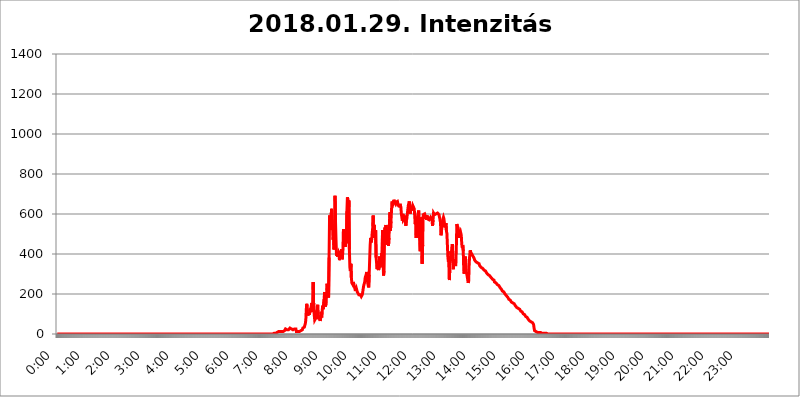
| Category | 2018.01.29. Intenzitás [W/m^2] |
|---|---|
| 0.0 | 0 |
| 0.0006944444444444445 | 0 |
| 0.001388888888888889 | 0 |
| 0.0020833333333333333 | 0 |
| 0.002777777777777778 | 0 |
| 0.003472222222222222 | 0 |
| 0.004166666666666667 | 0 |
| 0.004861111111111111 | 0 |
| 0.005555555555555556 | 0 |
| 0.0062499999999999995 | 0 |
| 0.006944444444444444 | 0 |
| 0.007638888888888889 | 0 |
| 0.008333333333333333 | 0 |
| 0.009027777777777779 | 0 |
| 0.009722222222222222 | 0 |
| 0.010416666666666666 | 0 |
| 0.011111111111111112 | 0 |
| 0.011805555555555555 | 0 |
| 0.012499999999999999 | 0 |
| 0.013194444444444444 | 0 |
| 0.013888888888888888 | 0 |
| 0.014583333333333332 | 0 |
| 0.015277777777777777 | 0 |
| 0.015972222222222224 | 0 |
| 0.016666666666666666 | 0 |
| 0.017361111111111112 | 0 |
| 0.018055555555555557 | 0 |
| 0.01875 | 0 |
| 0.019444444444444445 | 0 |
| 0.02013888888888889 | 0 |
| 0.020833333333333332 | 0 |
| 0.02152777777777778 | 0 |
| 0.022222222222222223 | 0 |
| 0.02291666666666667 | 0 |
| 0.02361111111111111 | 0 |
| 0.024305555555555556 | 0 |
| 0.024999999999999998 | 0 |
| 0.025694444444444447 | 0 |
| 0.02638888888888889 | 0 |
| 0.027083333333333334 | 0 |
| 0.027777777777777776 | 0 |
| 0.02847222222222222 | 0 |
| 0.029166666666666664 | 0 |
| 0.029861111111111113 | 0 |
| 0.030555555555555555 | 0 |
| 0.03125 | 0 |
| 0.03194444444444445 | 0 |
| 0.03263888888888889 | 0 |
| 0.03333333333333333 | 0 |
| 0.034027777777777775 | 0 |
| 0.034722222222222224 | 0 |
| 0.035416666666666666 | 0 |
| 0.036111111111111115 | 0 |
| 0.03680555555555556 | 0 |
| 0.0375 | 0 |
| 0.03819444444444444 | 0 |
| 0.03888888888888889 | 0 |
| 0.03958333333333333 | 0 |
| 0.04027777777777778 | 0 |
| 0.04097222222222222 | 0 |
| 0.041666666666666664 | 0 |
| 0.042361111111111106 | 0 |
| 0.04305555555555556 | 0 |
| 0.043750000000000004 | 0 |
| 0.044444444444444446 | 0 |
| 0.04513888888888889 | 0 |
| 0.04583333333333334 | 0 |
| 0.04652777777777778 | 0 |
| 0.04722222222222222 | 0 |
| 0.04791666666666666 | 0 |
| 0.04861111111111111 | 0 |
| 0.049305555555555554 | 0 |
| 0.049999999999999996 | 0 |
| 0.05069444444444445 | 0 |
| 0.051388888888888894 | 0 |
| 0.052083333333333336 | 0 |
| 0.05277777777777778 | 0 |
| 0.05347222222222222 | 0 |
| 0.05416666666666667 | 0 |
| 0.05486111111111111 | 0 |
| 0.05555555555555555 | 0 |
| 0.05625 | 0 |
| 0.05694444444444444 | 0 |
| 0.057638888888888885 | 0 |
| 0.05833333333333333 | 0 |
| 0.05902777777777778 | 0 |
| 0.059722222222222225 | 0 |
| 0.06041666666666667 | 0 |
| 0.061111111111111116 | 0 |
| 0.06180555555555556 | 0 |
| 0.0625 | 0 |
| 0.06319444444444444 | 0 |
| 0.06388888888888888 | 0 |
| 0.06458333333333334 | 0 |
| 0.06527777777777778 | 0 |
| 0.06597222222222222 | 0 |
| 0.06666666666666667 | 0 |
| 0.06736111111111111 | 0 |
| 0.06805555555555555 | 0 |
| 0.06874999999999999 | 0 |
| 0.06944444444444443 | 0 |
| 0.07013888888888889 | 0 |
| 0.07083333333333333 | 0 |
| 0.07152777777777779 | 0 |
| 0.07222222222222223 | 0 |
| 0.07291666666666667 | 0 |
| 0.07361111111111111 | 0 |
| 0.07430555555555556 | 0 |
| 0.075 | 0 |
| 0.07569444444444444 | 0 |
| 0.0763888888888889 | 0 |
| 0.07708333333333334 | 0 |
| 0.07777777777777778 | 0 |
| 0.07847222222222222 | 0 |
| 0.07916666666666666 | 0 |
| 0.0798611111111111 | 0 |
| 0.08055555555555556 | 0 |
| 0.08125 | 0 |
| 0.08194444444444444 | 0 |
| 0.08263888888888889 | 0 |
| 0.08333333333333333 | 0 |
| 0.08402777777777777 | 0 |
| 0.08472222222222221 | 0 |
| 0.08541666666666665 | 0 |
| 0.08611111111111112 | 0 |
| 0.08680555555555557 | 0 |
| 0.08750000000000001 | 0 |
| 0.08819444444444445 | 0 |
| 0.08888888888888889 | 0 |
| 0.08958333333333333 | 0 |
| 0.09027777777777778 | 0 |
| 0.09097222222222222 | 0 |
| 0.09166666666666667 | 0 |
| 0.09236111111111112 | 0 |
| 0.09305555555555556 | 0 |
| 0.09375 | 0 |
| 0.09444444444444444 | 0 |
| 0.09513888888888888 | 0 |
| 0.09583333333333333 | 0 |
| 0.09652777777777777 | 0 |
| 0.09722222222222222 | 0 |
| 0.09791666666666667 | 0 |
| 0.09861111111111111 | 0 |
| 0.09930555555555555 | 0 |
| 0.09999999999999999 | 0 |
| 0.10069444444444443 | 0 |
| 0.1013888888888889 | 0 |
| 0.10208333333333335 | 0 |
| 0.10277777777777779 | 0 |
| 0.10347222222222223 | 0 |
| 0.10416666666666667 | 0 |
| 0.10486111111111111 | 0 |
| 0.10555555555555556 | 0 |
| 0.10625 | 0 |
| 0.10694444444444444 | 0 |
| 0.1076388888888889 | 0 |
| 0.10833333333333334 | 0 |
| 0.10902777777777778 | 0 |
| 0.10972222222222222 | 0 |
| 0.1111111111111111 | 0 |
| 0.11180555555555556 | 0 |
| 0.11180555555555556 | 0 |
| 0.1125 | 0 |
| 0.11319444444444444 | 0 |
| 0.11388888888888889 | 0 |
| 0.11458333333333333 | 0 |
| 0.11527777777777777 | 0 |
| 0.11597222222222221 | 0 |
| 0.11666666666666665 | 0 |
| 0.1173611111111111 | 0 |
| 0.11805555555555557 | 0 |
| 0.11944444444444445 | 0 |
| 0.12013888888888889 | 0 |
| 0.12083333333333333 | 0 |
| 0.12152777777777778 | 0 |
| 0.12222222222222223 | 0 |
| 0.12291666666666667 | 0 |
| 0.12291666666666667 | 0 |
| 0.12361111111111112 | 0 |
| 0.12430555555555556 | 0 |
| 0.125 | 0 |
| 0.12569444444444444 | 0 |
| 0.12638888888888888 | 0 |
| 0.12708333333333333 | 0 |
| 0.16875 | 0 |
| 0.12847222222222224 | 0 |
| 0.12916666666666668 | 0 |
| 0.12986111111111112 | 0 |
| 0.13055555555555556 | 0 |
| 0.13125 | 0 |
| 0.13194444444444445 | 0 |
| 0.1326388888888889 | 0 |
| 0.13333333333333333 | 0 |
| 0.13402777777777777 | 0 |
| 0.13402777777777777 | 0 |
| 0.13472222222222222 | 0 |
| 0.13541666666666666 | 0 |
| 0.1361111111111111 | 0 |
| 0.13749999999999998 | 0 |
| 0.13819444444444443 | 0 |
| 0.1388888888888889 | 0 |
| 0.13958333333333334 | 0 |
| 0.14027777777777778 | 0 |
| 0.14097222222222222 | 0 |
| 0.14166666666666666 | 0 |
| 0.1423611111111111 | 0 |
| 0.14305555555555557 | 0 |
| 0.14375000000000002 | 0 |
| 0.14444444444444446 | 0 |
| 0.1451388888888889 | 0 |
| 0.1451388888888889 | 0 |
| 0.14652777777777778 | 0 |
| 0.14722222222222223 | 0 |
| 0.14791666666666667 | 0 |
| 0.1486111111111111 | 0 |
| 0.14930555555555555 | 0 |
| 0.15 | 0 |
| 0.15069444444444444 | 0 |
| 0.15138888888888888 | 0 |
| 0.15208333333333332 | 0 |
| 0.15277777777777776 | 0 |
| 0.15347222222222223 | 0 |
| 0.15416666666666667 | 0 |
| 0.15486111111111112 | 0 |
| 0.15555555555555556 | 0 |
| 0.15625 | 0 |
| 0.15694444444444444 | 0 |
| 0.15763888888888888 | 0 |
| 0.15833333333333333 | 0 |
| 0.15902777777777777 | 0 |
| 0.15972222222222224 | 0 |
| 0.16041666666666668 | 0 |
| 0.16111111111111112 | 0 |
| 0.16180555555555556 | 0 |
| 0.1625 | 0 |
| 0.16319444444444445 | 0 |
| 0.1638888888888889 | 0 |
| 0.16458333333333333 | 0 |
| 0.16527777777777777 | 0 |
| 0.16597222222222222 | 0 |
| 0.16666666666666666 | 0 |
| 0.1673611111111111 | 0 |
| 0.16805555555555554 | 0 |
| 0.16874999999999998 | 0 |
| 0.16944444444444443 | 0 |
| 0.17013888888888887 | 0 |
| 0.1708333333333333 | 0 |
| 0.17152777777777775 | 0 |
| 0.17222222222222225 | 0 |
| 0.1729166666666667 | 0 |
| 0.17361111111111113 | 0 |
| 0.17430555555555557 | 0 |
| 0.17500000000000002 | 0 |
| 0.17569444444444446 | 0 |
| 0.1763888888888889 | 0 |
| 0.17708333333333334 | 0 |
| 0.17777777777777778 | 0 |
| 0.17847222222222223 | 0 |
| 0.17916666666666667 | 0 |
| 0.1798611111111111 | 0 |
| 0.18055555555555555 | 0 |
| 0.18125 | 0 |
| 0.18194444444444444 | 0 |
| 0.1826388888888889 | 0 |
| 0.18333333333333335 | 0 |
| 0.1840277777777778 | 0 |
| 0.18472222222222223 | 0 |
| 0.18541666666666667 | 0 |
| 0.18611111111111112 | 0 |
| 0.18680555555555556 | 0 |
| 0.1875 | 0 |
| 0.18819444444444444 | 0 |
| 0.18888888888888888 | 0 |
| 0.18958333333333333 | 0 |
| 0.19027777777777777 | 0 |
| 0.1909722222222222 | 0 |
| 0.19166666666666665 | 0 |
| 0.19236111111111112 | 0 |
| 0.19305555555555554 | 0 |
| 0.19375 | 0 |
| 0.19444444444444445 | 0 |
| 0.1951388888888889 | 0 |
| 0.19583333333333333 | 0 |
| 0.19652777777777777 | 0 |
| 0.19722222222222222 | 0 |
| 0.19791666666666666 | 0 |
| 0.1986111111111111 | 0 |
| 0.19930555555555554 | 0 |
| 0.19999999999999998 | 0 |
| 0.20069444444444443 | 0 |
| 0.20138888888888887 | 0 |
| 0.2020833333333333 | 0 |
| 0.2027777777777778 | 0 |
| 0.2034722222222222 | 0 |
| 0.2041666666666667 | 0 |
| 0.20486111111111113 | 0 |
| 0.20555555555555557 | 0 |
| 0.20625000000000002 | 0 |
| 0.20694444444444446 | 0 |
| 0.2076388888888889 | 0 |
| 0.20833333333333334 | 0 |
| 0.20902777777777778 | 0 |
| 0.20972222222222223 | 0 |
| 0.21041666666666667 | 0 |
| 0.2111111111111111 | 0 |
| 0.21180555555555555 | 0 |
| 0.2125 | 0 |
| 0.21319444444444444 | 0 |
| 0.2138888888888889 | 0 |
| 0.21458333333333335 | 0 |
| 0.2152777777777778 | 0 |
| 0.21597222222222223 | 0 |
| 0.21666666666666667 | 0 |
| 0.21736111111111112 | 0 |
| 0.21805555555555556 | 0 |
| 0.21875 | 0 |
| 0.21944444444444444 | 0 |
| 0.22013888888888888 | 0 |
| 0.22083333333333333 | 0 |
| 0.22152777777777777 | 0 |
| 0.2222222222222222 | 0 |
| 0.22291666666666665 | 0 |
| 0.2236111111111111 | 0 |
| 0.22430555555555556 | 0 |
| 0.225 | 0 |
| 0.22569444444444445 | 0 |
| 0.2263888888888889 | 0 |
| 0.22708333333333333 | 0 |
| 0.22777777777777777 | 0 |
| 0.22847222222222222 | 0 |
| 0.22916666666666666 | 0 |
| 0.2298611111111111 | 0 |
| 0.23055555555555554 | 0 |
| 0.23124999999999998 | 0 |
| 0.23194444444444443 | 0 |
| 0.23263888888888887 | 0 |
| 0.2333333333333333 | 0 |
| 0.2340277777777778 | 0 |
| 0.2347222222222222 | 0 |
| 0.2354166666666667 | 0 |
| 0.23611111111111113 | 0 |
| 0.23680555555555557 | 0 |
| 0.23750000000000002 | 0 |
| 0.23819444444444446 | 0 |
| 0.2388888888888889 | 0 |
| 0.23958333333333334 | 0 |
| 0.24027777777777778 | 0 |
| 0.24097222222222223 | 0 |
| 0.24166666666666667 | 0 |
| 0.2423611111111111 | 0 |
| 0.24305555555555555 | 0 |
| 0.24375 | 0 |
| 0.24444444444444446 | 0 |
| 0.24513888888888888 | 0 |
| 0.24583333333333335 | 0 |
| 0.2465277777777778 | 0 |
| 0.24722222222222223 | 0 |
| 0.24791666666666667 | 0 |
| 0.24861111111111112 | 0 |
| 0.24930555555555556 | 0 |
| 0.25 | 0 |
| 0.25069444444444444 | 0 |
| 0.2513888888888889 | 0 |
| 0.2520833333333333 | 0 |
| 0.25277777777777777 | 0 |
| 0.2534722222222222 | 0 |
| 0.25416666666666665 | 0 |
| 0.2548611111111111 | 0 |
| 0.2555555555555556 | 0 |
| 0.25625000000000003 | 0 |
| 0.2569444444444445 | 0 |
| 0.2576388888888889 | 0 |
| 0.25833333333333336 | 0 |
| 0.2590277777777778 | 0 |
| 0.25972222222222224 | 0 |
| 0.2604166666666667 | 0 |
| 0.2611111111111111 | 0 |
| 0.26180555555555557 | 0 |
| 0.2625 | 0 |
| 0.26319444444444445 | 0 |
| 0.2638888888888889 | 0 |
| 0.26458333333333334 | 0 |
| 0.2652777777777778 | 0 |
| 0.2659722222222222 | 0 |
| 0.26666666666666666 | 0 |
| 0.2673611111111111 | 0 |
| 0.26805555555555555 | 0 |
| 0.26875 | 0 |
| 0.26944444444444443 | 0 |
| 0.2701388888888889 | 0 |
| 0.2708333333333333 | 0 |
| 0.27152777777777776 | 0 |
| 0.2722222222222222 | 0 |
| 0.27291666666666664 | 0 |
| 0.2736111111111111 | 0 |
| 0.2743055555555555 | 0 |
| 0.27499999999999997 | 0 |
| 0.27569444444444446 | 0 |
| 0.27638888888888885 | 0 |
| 0.27708333333333335 | 0 |
| 0.2777777777777778 | 0 |
| 0.27847222222222223 | 0 |
| 0.2791666666666667 | 0 |
| 0.2798611111111111 | 0 |
| 0.28055555555555556 | 0 |
| 0.28125 | 0 |
| 0.28194444444444444 | 0 |
| 0.2826388888888889 | 0 |
| 0.2833333333333333 | 0 |
| 0.28402777777777777 | 0 |
| 0.2847222222222222 | 0 |
| 0.28541666666666665 | 0 |
| 0.28611111111111115 | 0 |
| 0.28680555555555554 | 0 |
| 0.28750000000000003 | 0 |
| 0.2881944444444445 | 0 |
| 0.2888888888888889 | 0 |
| 0.28958333333333336 | 0 |
| 0.2902777777777778 | 0 |
| 0.29097222222222224 | 0 |
| 0.2916666666666667 | 0 |
| 0.2923611111111111 | 0 |
| 0.29305555555555557 | 0 |
| 0.29375 | 0 |
| 0.29444444444444445 | 0 |
| 0.2951388888888889 | 0 |
| 0.29583333333333334 | 0 |
| 0.2965277777777778 | 0 |
| 0.2972222222222222 | 0 |
| 0.29791666666666666 | 0 |
| 0.2986111111111111 | 0 |
| 0.29930555555555555 | 0 |
| 0.3 | 0 |
| 0.30069444444444443 | 0 |
| 0.3013888888888889 | 0 |
| 0.3020833333333333 | 0 |
| 0.30277777777777776 | 0 |
| 0.3034722222222222 | 3.525 |
| 0.30416666666666664 | 3.525 |
| 0.3048611111111111 | 3.525 |
| 0.3055555555555555 | 3.525 |
| 0.30624999999999997 | 3.525 |
| 0.3069444444444444 | 3.525 |
| 0.3076388888888889 | 3.525 |
| 0.30833333333333335 | 7.887 |
| 0.3090277777777778 | 7.887 |
| 0.30972222222222223 | 7.887 |
| 0.3104166666666667 | 12.257 |
| 0.3111111111111111 | 12.257 |
| 0.31180555555555556 | 12.257 |
| 0.3125 | 12.257 |
| 0.31319444444444444 | 12.257 |
| 0.3138888888888889 | 12.257 |
| 0.3145833333333333 | 12.257 |
| 0.31527777777777777 | 12.257 |
| 0.3159722222222222 | 12.257 |
| 0.31666666666666665 | 12.257 |
| 0.31736111111111115 | 12.257 |
| 0.31805555555555554 | 12.257 |
| 0.31875000000000003 | 16.636 |
| 0.3194444444444445 | 21.024 |
| 0.3201388888888889 | 25.419 |
| 0.32083333333333336 | 25.419 |
| 0.3215277777777778 | 25.419 |
| 0.32222222222222224 | 21.024 |
| 0.3229166666666667 | 21.024 |
| 0.3236111111111111 | 21.024 |
| 0.32430555555555557 | 21.024 |
| 0.325 | 21.024 |
| 0.32569444444444445 | 25.419 |
| 0.3263888888888889 | 29.823 |
| 0.32708333333333334 | 25.419 |
| 0.3277777777777778 | 29.823 |
| 0.3284722222222222 | 25.419 |
| 0.32916666666666666 | 25.419 |
| 0.3298611111111111 | 25.419 |
| 0.33055555555555555 | 21.024 |
| 0.33125 | 21.024 |
| 0.33194444444444443 | 21.024 |
| 0.3326388888888889 | 25.419 |
| 0.3333333333333333 | 25.419 |
| 0.3340277777777778 | 21.024 |
| 0.3347222222222222 | 25.419 |
| 0.3354166666666667 | 12.257 |
| 0.3361111111111111 | 12.257 |
| 0.3368055555555556 | 12.257 |
| 0.33749999999999997 | 12.257 |
| 0.33819444444444446 | 12.257 |
| 0.33888888888888885 | 12.257 |
| 0.33958333333333335 | 12.257 |
| 0.34027777777777773 | 12.257 |
| 0.34097222222222223 | 16.636 |
| 0.3416666666666666 | 16.636 |
| 0.3423611111111111 | 21.024 |
| 0.3430555555555555 | 16.636 |
| 0.34375 | 21.024 |
| 0.3444444444444445 | 29.823 |
| 0.3451388888888889 | 29.823 |
| 0.3458333333333334 | 29.823 |
| 0.34652777777777777 | 34.234 |
| 0.34722222222222227 | 43.079 |
| 0.34791666666666665 | 51.951 |
| 0.34861111111111115 | 69.775 |
| 0.34930555555555554 | 123.758 |
| 0.35000000000000003 | 150.964 |
| 0.3506944444444444 | 114.716 |
| 0.3513888888888889 | 92.184 |
| 0.3520833333333333 | 101.184 |
| 0.3527777777777778 | 110.201 |
| 0.3534722222222222 | 96.682 |
| 0.3541666666666667 | 101.184 |
| 0.3548611111111111 | 96.682 |
| 0.35555555555555557 | 128.284 |
| 0.35625 | 137.347 |
| 0.35694444444444445 | 155.509 |
| 0.3576388888888889 | 119.235 |
| 0.35833333333333334 | 110.201 |
| 0.3590277777777778 | 260.373 |
| 0.3597222222222222 | 128.284 |
| 0.36041666666666666 | 96.682 |
| 0.3611111111111111 | 69.775 |
| 0.36180555555555555 | 69.775 |
| 0.3625 | 69.775 |
| 0.36319444444444443 | 83.205 |
| 0.3638888888888889 | 92.184 |
| 0.3645833333333333 | 132.814 |
| 0.3652777777777778 | 146.423 |
| 0.3659722222222222 | 74.246 |
| 0.3666666666666667 | 74.246 |
| 0.3673611111111111 | 92.184 |
| 0.3680555555555556 | 74.246 |
| 0.36874999999999997 | 65.31 |
| 0.36944444444444446 | 78.722 |
| 0.37013888888888885 | 110.201 |
| 0.37083333333333335 | 83.205 |
| 0.37152777777777773 | 114.716 |
| 0.37222222222222223 | 141.884 |
| 0.3729166666666666 | 123.758 |
| 0.3736111111111111 | 123.758 |
| 0.3743055555555555 | 173.709 |
| 0.375 | 210.182 |
| 0.3756944444444445 | 137.347 |
| 0.3763888888888889 | 141.884 |
| 0.3770833333333334 | 150.964 |
| 0.37777777777777777 | 201.058 |
| 0.37847222222222227 | 251.251 |
| 0.37916666666666665 | 196.497 |
| 0.37986111111111115 | 228.436 |
| 0.38055555555555554 | 182.82 |
| 0.38125000000000003 | 382.715 |
| 0.3819444444444444 | 592.233 |
| 0.3826388888888889 | 541.121 |
| 0.3833333333333333 | 519.555 |
| 0.3840277777777778 | 515.223 |
| 0.3847222222222222 | 625.784 |
| 0.3854166666666667 | 629.948 |
| 0.3861111111111111 | 532.513 |
| 0.38680555555555557 | 471.582 |
| 0.3875 | 493.475 |
| 0.38819444444444445 | 422.943 |
| 0.3888888888888889 | 462.786 |
| 0.38958333333333334 | 691.608 |
| 0.3902777777777778 | 562.53 |
| 0.3909722222222222 | 471.582 |
| 0.39166666666666666 | 391.685 |
| 0.3923611111111111 | 400.638 |
| 0.39305555555555555 | 387.202 |
| 0.39375 | 396.164 |
| 0.39444444444444443 | 405.108 |
| 0.3951388888888889 | 396.164 |
| 0.3958333333333333 | 369.23 |
| 0.3965277777777778 | 414.035 |
| 0.3972222222222222 | 382.715 |
| 0.3979166666666667 | 378.224 |
| 0.3986111111111111 | 422.943 |
| 0.3993055555555556 | 373.729 |
| 0.39999999999999997 | 382.715 |
| 0.40069444444444446 | 422.943 |
| 0.40138888888888885 | 523.88 |
| 0.40208333333333335 | 480.356 |
| 0.40277777777777773 | 471.582 |
| 0.40347222222222223 | 515.223 |
| 0.4041666666666666 | 436.27 |
| 0.4048611111111111 | 506.542 |
| 0.4055555555555555 | 453.968 |
| 0.40625 | 613.252 |
| 0.4069444444444445 | 683.473 |
| 0.4076388888888889 | 671.22 |
| 0.4083333333333334 | 604.864 |
| 0.40902777777777777 | 667.123 |
| 0.40972222222222227 | 422.943 |
| 0.41041666666666665 | 333.113 |
| 0.41111111111111115 | 314.98 |
| 0.41180555555555554 | 351.198 |
| 0.41250000000000003 | 283.156 |
| 0.4131944444444444 | 255.813 |
| 0.4138888888888889 | 255.813 |
| 0.4145833333333333 | 246.689 |
| 0.4152777777777778 | 260.373 |
| 0.4159722222222222 | 246.689 |
| 0.4166666666666667 | 246.689 |
| 0.4173611111111111 | 233 |
| 0.41805555555555557 | 214.746 |
| 0.41875 | 214.746 |
| 0.41944444444444445 | 228.436 |
| 0.4201388888888889 | 219.309 |
| 0.42083333333333334 | 210.182 |
| 0.4215277777777778 | 214.746 |
| 0.4222222222222222 | 210.182 |
| 0.42291666666666666 | 196.497 |
| 0.4236111111111111 | 196.497 |
| 0.42430555555555555 | 196.497 |
| 0.425 | 196.497 |
| 0.42569444444444443 | 191.937 |
| 0.4263888888888889 | 187.378 |
| 0.4270833333333333 | 191.937 |
| 0.4277777777777778 | 196.497 |
| 0.4284722222222222 | 210.182 |
| 0.4291666666666667 | 228.436 |
| 0.4298611111111111 | 242.127 |
| 0.4305555555555556 | 246.689 |
| 0.43124999999999997 | 260.373 |
| 0.43194444444444446 | 283.156 |
| 0.43263888888888885 | 283.156 |
| 0.43333333333333335 | 296.808 |
| 0.43402777777777773 | 310.44 |
| 0.43472222222222223 | 278.603 |
| 0.4354166666666666 | 255.813 |
| 0.4361111111111111 | 242.127 |
| 0.4368055555555555 | 233 |
| 0.4375 | 296.808 |
| 0.4381944444444445 | 373.729 |
| 0.4388888888888889 | 445.129 |
| 0.4395833333333334 | 480.356 |
| 0.44027777777777777 | 458.38 |
| 0.44097222222222227 | 471.582 |
| 0.44166666666666665 | 502.192 |
| 0.44236111111111115 | 528.2 |
| 0.44305555555555554 | 592.233 |
| 0.44375000000000003 | 480.356 |
| 0.4444444444444444 | 545.416 |
| 0.4451388888888889 | 497.836 |
| 0.4458333333333333 | 489.108 |
| 0.4465277777777778 | 519.555 |
| 0.4472222222222222 | 382.715 |
| 0.4479166666666667 | 382.715 |
| 0.4486111111111111 | 324.052 |
| 0.44930555555555557 | 364.728 |
| 0.45 | 360.221 |
| 0.45069444444444445 | 319.517 |
| 0.4513888888888889 | 333.113 |
| 0.45208333333333334 | 387.202 |
| 0.4527777777777778 | 333.113 |
| 0.4534722222222222 | 369.23 |
| 0.45416666666666666 | 346.682 |
| 0.4548611111111111 | 405.108 |
| 0.45555555555555555 | 364.728 |
| 0.45625 | 519.555 |
| 0.45694444444444443 | 378.224 |
| 0.4576388888888889 | 292.259 |
| 0.4583333333333333 | 314.98 |
| 0.4590277777777778 | 471.582 |
| 0.4597222222222222 | 532.513 |
| 0.4604166666666667 | 467.187 |
| 0.4611111111111111 | 545.416 |
| 0.4618055555555556 | 541.121 |
| 0.46249999999999997 | 445.129 |
| 0.46319444444444446 | 523.88 |
| 0.46388888888888885 | 502.192 |
| 0.46458333333333335 | 440.702 |
| 0.46527777777777773 | 480.356 |
| 0.46597222222222223 | 562.53 |
| 0.4666666666666666 | 609.062 |
| 0.4673611111111111 | 515.223 |
| 0.4680555555555555 | 562.53 |
| 0.46875 | 613.252 |
| 0.4694444444444445 | 663.019 |
| 0.4701388888888889 | 667.123 |
| 0.4708333333333334 | 650.667 |
| 0.47152777777777777 | 658.909 |
| 0.47222222222222227 | 671.22 |
| 0.47291666666666665 | 658.909 |
| 0.47361111111111115 | 658.909 |
| 0.47430555555555554 | 650.667 |
| 0.47500000000000003 | 658.909 |
| 0.4756944444444444 | 654.791 |
| 0.4763888888888889 | 654.791 |
| 0.4770833333333333 | 663.019 |
| 0.4777777777777778 | 650.667 |
| 0.4784722222222222 | 638.256 |
| 0.4791666666666667 | 646.537 |
| 0.4798611111111111 | 634.105 |
| 0.48055555555555557 | 650.667 |
| 0.48125 | 646.537 |
| 0.48194444444444445 | 634.105 |
| 0.4826388888888889 | 600.661 |
| 0.48333333333333334 | 583.779 |
| 0.4840277777777778 | 566.793 |
| 0.4847222222222222 | 600.661 |
| 0.48541666666666666 | 571.049 |
| 0.4861111111111111 | 575.299 |
| 0.48680555555555555 | 579.542 |
| 0.4875 | 592.233 |
| 0.48819444444444443 | 571.049 |
| 0.4888888888888889 | 541.121 |
| 0.4895833333333333 | 566.793 |
| 0.4902777777777778 | 575.299 |
| 0.4909722222222222 | 575.299 |
| 0.4916666666666667 | 621.613 |
| 0.4923611111111111 | 642.4 |
| 0.4930555555555556 | 642.4 |
| 0.49374999999999997 | 663.019 |
| 0.49444444444444446 | 642.4 |
| 0.49513888888888885 | 600.661 |
| 0.49583333333333335 | 634.105 |
| 0.49652777777777773 | 625.784 |
| 0.49722222222222223 | 617.436 |
| 0.4979166666666666 | 621.613 |
| 0.4986111111111111 | 642.4 |
| 0.4993055555555555 | 646.537 |
| 0.5 | 642.4 |
| 0.5006944444444444 | 625.784 |
| 0.5013888888888889 | 625.784 |
| 0.5020833333333333 | 549.704 |
| 0.5027777777777778 | 575.299 |
| 0.5034722222222222 | 480.356 |
| 0.5041666666666667 | 545.416 |
| 0.5048611111111111 | 566.793 |
| 0.5055555555555555 | 592.233 |
| 0.50625 | 592.233 |
| 0.5069444444444444 | 617.436 |
| 0.5076388888888889 | 523.88 |
| 0.5083333333333333 | 462.786 |
| 0.5090277777777777 | 414.035 |
| 0.5097222222222222 | 523.88 |
| 0.5104166666666666 | 553.986 |
| 0.5111111111111112 | 583.779 |
| 0.5118055555555555 | 351.198 |
| 0.5125000000000001 | 445.129 |
| 0.5131944444444444 | 596.45 |
| 0.513888888888889 | 596.45 |
| 0.5145833333333333 | 592.233 |
| 0.5152777777777778 | 600.661 |
| 0.5159722222222222 | 592.233 |
| 0.5166666666666667 | 575.299 |
| 0.517361111111111 | 592.233 |
| 0.5180555555555556 | 571.049 |
| 0.5187499999999999 | 592.233 |
| 0.5194444444444445 | 575.299 |
| 0.5201388888888888 | 575.299 |
| 0.5208333333333334 | 571.049 |
| 0.5215277777777778 | 571.049 |
| 0.5222222222222223 | 571.049 |
| 0.5229166666666667 | 571.049 |
| 0.5236111111111111 | 583.779 |
| 0.5243055555555556 | 583.779 |
| 0.525 | 575.299 |
| 0.5256944444444445 | 566.793 |
| 0.5263888888888889 | 541.121 |
| 0.5270833333333333 | 571.049 |
| 0.5277777777777778 | 604.864 |
| 0.5284722222222222 | 600.661 |
| 0.5291666666666667 | 596.45 |
| 0.5298611111111111 | 600.661 |
| 0.5305555555555556 | 596.45 |
| 0.53125 | 600.661 |
| 0.5319444444444444 | 600.661 |
| 0.5326388888888889 | 596.45 |
| 0.5333333333333333 | 604.864 |
| 0.5340277777777778 | 600.661 |
| 0.5347222222222222 | 600.661 |
| 0.5354166666666667 | 596.45 |
| 0.5361111111111111 | 592.233 |
| 0.5368055555555555 | 596.45 |
| 0.5375 | 558.261 |
| 0.5381944444444444 | 493.475 |
| 0.5388888888888889 | 510.885 |
| 0.5395833333333333 | 545.416 |
| 0.5402777777777777 | 562.53 |
| 0.5409722222222222 | 575.299 |
| 0.5416666666666666 | 583.779 |
| 0.5423611111111112 | 575.299 |
| 0.5430555555555555 | 575.299 |
| 0.5437500000000001 | 532.513 |
| 0.5444444444444444 | 532.513 |
| 0.545138888888889 | 553.986 |
| 0.5458333333333333 | 515.223 |
| 0.5465277777777778 | 502.192 |
| 0.5472222222222222 | 440.702 |
| 0.5479166666666667 | 382.715 |
| 0.548611111111111 | 360.221 |
| 0.5493055555555556 | 387.202 |
| 0.5499999999999999 | 269.49 |
| 0.5506944444444445 | 346.682 |
| 0.5513888888888888 | 364.728 |
| 0.5520833333333334 | 414.035 |
| 0.5527777777777778 | 391.685 |
| 0.5534722222222223 | 391.685 |
| 0.5541666666666667 | 449.551 |
| 0.5548611111111111 | 387.202 |
| 0.5555555555555556 | 324.052 |
| 0.55625 | 373.729 |
| 0.5569444444444445 | 346.682 |
| 0.5576388888888889 | 351.198 |
| 0.5583333333333333 | 342.162 |
| 0.5590277777777778 | 346.682 |
| 0.5597222222222222 | 431.833 |
| 0.5604166666666667 | 549.704 |
| 0.5611111111111111 | 541.121 |
| 0.5618055555555556 | 536.82 |
| 0.5625 | 528.2 |
| 0.5631944444444444 | 480.356 |
| 0.5638888888888889 | 506.542 |
| 0.5645833333333333 | 510.885 |
| 0.5652777777777778 | 515.223 |
| 0.5659722222222222 | 515.223 |
| 0.5666666666666667 | 493.475 |
| 0.5673611111111111 | 449.551 |
| 0.5680555555555555 | 431.833 |
| 0.56875 | 445.129 |
| 0.5694444444444444 | 414.035 |
| 0.5701388888888889 | 319.517 |
| 0.5708333333333333 | 301.354 |
| 0.5715277777777777 | 342.162 |
| 0.5722222222222222 | 387.202 |
| 0.5729166666666666 | 369.23 |
| 0.5736111111111112 | 314.98 |
| 0.5743055555555555 | 301.354 |
| 0.5750000000000001 | 301.354 |
| 0.5756944444444444 | 301.354 |
| 0.576388888888889 | 255.813 |
| 0.5770833333333333 | 264.932 |
| 0.5777777777777778 | 355.712 |
| 0.5784722222222222 | 391.685 |
| 0.5791666666666667 | 418.492 |
| 0.579861111111111 | 409.574 |
| 0.5805555555555556 | 405.108 |
| 0.5812499999999999 | 400.638 |
| 0.5819444444444445 | 396.164 |
| 0.5826388888888888 | 396.164 |
| 0.5833333333333334 | 387.202 |
| 0.5840277777777778 | 382.715 |
| 0.5847222222222223 | 378.224 |
| 0.5854166666666667 | 369.23 |
| 0.5861111111111111 | 369.23 |
| 0.5868055555555556 | 364.728 |
| 0.5875 | 360.221 |
| 0.5881944444444445 | 360.221 |
| 0.5888888888888889 | 360.221 |
| 0.5895833333333333 | 355.712 |
| 0.5902777777777778 | 355.712 |
| 0.5909722222222222 | 351.198 |
| 0.5916666666666667 | 351.198 |
| 0.5923611111111111 | 342.162 |
| 0.5930555555555556 | 342.162 |
| 0.59375 | 342.162 |
| 0.5944444444444444 | 333.113 |
| 0.5951388888888889 | 333.113 |
| 0.5958333333333333 | 328.584 |
| 0.5965277777777778 | 328.584 |
| 0.5972222222222222 | 324.052 |
| 0.5979166666666667 | 324.052 |
| 0.5986111111111111 | 319.517 |
| 0.5993055555555555 | 314.98 |
| 0.6 | 314.98 |
| 0.6006944444444444 | 314.98 |
| 0.6013888888888889 | 310.44 |
| 0.6020833333333333 | 305.898 |
| 0.6027777777777777 | 305.898 |
| 0.6034722222222222 | 301.354 |
| 0.6041666666666666 | 296.808 |
| 0.6048611111111112 | 296.808 |
| 0.6055555555555555 | 292.259 |
| 0.6062500000000001 | 292.259 |
| 0.6069444444444444 | 287.709 |
| 0.607638888888889 | 287.709 |
| 0.6083333333333333 | 283.156 |
| 0.6090277777777778 | 278.603 |
| 0.6097222222222222 | 278.603 |
| 0.6104166666666667 | 274.047 |
| 0.611111111111111 | 274.047 |
| 0.6118055555555556 | 269.49 |
| 0.6124999999999999 | 269.49 |
| 0.6131944444444445 | 260.373 |
| 0.6138888888888888 | 260.373 |
| 0.6145833333333334 | 260.373 |
| 0.6152777777777778 | 255.813 |
| 0.6159722222222223 | 251.251 |
| 0.6166666666666667 | 251.251 |
| 0.6173611111111111 | 246.689 |
| 0.6180555555555556 | 242.127 |
| 0.61875 | 242.127 |
| 0.6194444444444445 | 242.127 |
| 0.6201388888888889 | 237.564 |
| 0.6208333333333333 | 233 |
| 0.6215277777777778 | 228.436 |
| 0.6222222222222222 | 228.436 |
| 0.6229166666666667 | 223.873 |
| 0.6236111111111111 | 219.309 |
| 0.6243055555555556 | 214.746 |
| 0.625 | 214.746 |
| 0.6256944444444444 | 210.182 |
| 0.6263888888888889 | 210.182 |
| 0.6270833333333333 | 205.62 |
| 0.6277777777777778 | 201.058 |
| 0.6284722222222222 | 201.058 |
| 0.6291666666666667 | 196.497 |
| 0.6298611111111111 | 191.937 |
| 0.6305555555555555 | 191.937 |
| 0.63125 | 187.378 |
| 0.6319444444444444 | 182.82 |
| 0.6326388888888889 | 178.264 |
| 0.6333333333333333 | 173.709 |
| 0.6340277777777777 | 173.709 |
| 0.6347222222222222 | 169.156 |
| 0.6354166666666666 | 169.156 |
| 0.6361111111111112 | 164.605 |
| 0.6368055555555555 | 160.056 |
| 0.6375000000000001 | 160.056 |
| 0.6381944444444444 | 155.509 |
| 0.638888888888889 | 155.509 |
| 0.6395833333333333 | 155.509 |
| 0.6402777777777778 | 150.964 |
| 0.6409722222222222 | 150.964 |
| 0.6416666666666667 | 146.423 |
| 0.642361111111111 | 141.884 |
| 0.6430555555555556 | 141.884 |
| 0.6437499999999999 | 137.347 |
| 0.6444444444444445 | 132.814 |
| 0.6451388888888888 | 132.814 |
| 0.6458333333333334 | 128.284 |
| 0.6465277777777778 | 128.284 |
| 0.6472222222222223 | 123.758 |
| 0.6479166666666667 | 123.758 |
| 0.6486111111111111 | 123.758 |
| 0.6493055555555556 | 119.235 |
| 0.65 | 114.716 |
| 0.6506944444444445 | 114.716 |
| 0.6513888888888889 | 110.201 |
| 0.6520833333333333 | 110.201 |
| 0.6527777777777778 | 105.69 |
| 0.6534722222222222 | 101.184 |
| 0.6541666666666667 | 101.184 |
| 0.6548611111111111 | 101.184 |
| 0.6555555555555556 | 96.682 |
| 0.65625 | 92.184 |
| 0.6569444444444444 | 87.692 |
| 0.6576388888888889 | 87.692 |
| 0.6583333333333333 | 83.205 |
| 0.6590277777777778 | 83.205 |
| 0.6597222222222222 | 78.722 |
| 0.6604166666666667 | 74.246 |
| 0.6611111111111111 | 74.246 |
| 0.6618055555555555 | 69.775 |
| 0.6625 | 65.31 |
| 0.6631944444444444 | 65.31 |
| 0.6638888888888889 | 60.85 |
| 0.6645833333333333 | 60.85 |
| 0.6652777777777777 | 56.398 |
| 0.6659722222222222 | 56.398 |
| 0.6666666666666666 | 56.398 |
| 0.6673611111111111 | 51.951 |
| 0.6680555555555556 | 47.511 |
| 0.6687500000000001 | 29.823 |
| 0.6694444444444444 | 16.636 |
| 0.6701388888888888 | 12.257 |
| 0.6708333333333334 | 12.257 |
| 0.6715277777777778 | 12.257 |
| 0.6722222222222222 | 12.257 |
| 0.6729166666666666 | 7.887 |
| 0.6736111111111112 | 7.887 |
| 0.6743055555555556 | 7.887 |
| 0.6749999999999999 | 7.887 |
| 0.6756944444444444 | 7.887 |
| 0.6763888888888889 | 7.887 |
| 0.6770833333333334 | 7.887 |
| 0.6777777777777777 | 7.887 |
| 0.6784722222222223 | 7.887 |
| 0.6791666666666667 | 3.525 |
| 0.6798611111111111 | 3.525 |
| 0.6805555555555555 | 3.525 |
| 0.68125 | 3.525 |
| 0.6819444444444445 | 3.525 |
| 0.6826388888888889 | 3.525 |
| 0.6833333333333332 | 3.525 |
| 0.6840277777777778 | 3.525 |
| 0.6847222222222222 | 3.525 |
| 0.6854166666666667 | 3.525 |
| 0.686111111111111 | 3.525 |
| 0.6868055555555556 | 3.525 |
| 0.6875 | 3.525 |
| 0.6881944444444444 | 0 |
| 0.688888888888889 | 0 |
| 0.6895833333333333 | 0 |
| 0.6902777777777778 | 0 |
| 0.6909722222222222 | 0 |
| 0.6916666666666668 | 0 |
| 0.6923611111111111 | 0 |
| 0.6930555555555555 | 0 |
| 0.69375 | 0 |
| 0.6944444444444445 | 0 |
| 0.6951388888888889 | 0 |
| 0.6958333333333333 | 0 |
| 0.6965277777777777 | 0 |
| 0.6972222222222223 | 0 |
| 0.6979166666666666 | 0 |
| 0.6986111111111111 | 0 |
| 0.6993055555555556 | 0 |
| 0.7000000000000001 | 0 |
| 0.7006944444444444 | 0 |
| 0.7013888888888888 | 0 |
| 0.7020833333333334 | 0 |
| 0.7027777777777778 | 0 |
| 0.7034722222222222 | 0 |
| 0.7041666666666666 | 0 |
| 0.7048611111111112 | 0 |
| 0.7055555555555556 | 0 |
| 0.7062499999999999 | 0 |
| 0.7069444444444444 | 0 |
| 0.7076388888888889 | 0 |
| 0.7083333333333334 | 0 |
| 0.7090277777777777 | 0 |
| 0.7097222222222223 | 0 |
| 0.7104166666666667 | 0 |
| 0.7111111111111111 | 0 |
| 0.7118055555555555 | 0 |
| 0.7125 | 0 |
| 0.7131944444444445 | 0 |
| 0.7138888888888889 | 0 |
| 0.7145833333333332 | 0 |
| 0.7152777777777778 | 0 |
| 0.7159722222222222 | 0 |
| 0.7166666666666667 | 0 |
| 0.717361111111111 | 0 |
| 0.7180555555555556 | 0 |
| 0.71875 | 0 |
| 0.7194444444444444 | 0 |
| 0.720138888888889 | 0 |
| 0.7208333333333333 | 0 |
| 0.7215277777777778 | 0 |
| 0.7222222222222222 | 0 |
| 0.7229166666666668 | 0 |
| 0.7236111111111111 | 0 |
| 0.7243055555555555 | 0 |
| 0.725 | 0 |
| 0.7256944444444445 | 0 |
| 0.7263888888888889 | 0 |
| 0.7270833333333333 | 0 |
| 0.7277777777777777 | 0 |
| 0.7284722222222223 | 0 |
| 0.7291666666666666 | 0 |
| 0.7298611111111111 | 0 |
| 0.7305555555555556 | 0 |
| 0.7312500000000001 | 0 |
| 0.7319444444444444 | 0 |
| 0.7326388888888888 | 0 |
| 0.7333333333333334 | 0 |
| 0.7340277777777778 | 0 |
| 0.7347222222222222 | 0 |
| 0.7354166666666666 | 0 |
| 0.7361111111111112 | 0 |
| 0.7368055555555556 | 0 |
| 0.7374999999999999 | 0 |
| 0.7381944444444444 | 0 |
| 0.7388888888888889 | 0 |
| 0.7395833333333334 | 0 |
| 0.7402777777777777 | 0 |
| 0.7409722222222223 | 0 |
| 0.7416666666666667 | 0 |
| 0.7423611111111111 | 0 |
| 0.7430555555555555 | 0 |
| 0.74375 | 0 |
| 0.7444444444444445 | 0 |
| 0.7451388888888889 | 0 |
| 0.7458333333333332 | 0 |
| 0.7465277777777778 | 0 |
| 0.7472222222222222 | 0 |
| 0.7479166666666667 | 0 |
| 0.748611111111111 | 0 |
| 0.7493055555555556 | 0 |
| 0.75 | 0 |
| 0.7506944444444444 | 0 |
| 0.751388888888889 | 0 |
| 0.7520833333333333 | 0 |
| 0.7527777777777778 | 0 |
| 0.7534722222222222 | 0 |
| 0.7541666666666668 | 0 |
| 0.7548611111111111 | 0 |
| 0.7555555555555555 | 0 |
| 0.75625 | 0 |
| 0.7569444444444445 | 0 |
| 0.7576388888888889 | 0 |
| 0.7583333333333333 | 0 |
| 0.7590277777777777 | 0 |
| 0.7597222222222223 | 0 |
| 0.7604166666666666 | 0 |
| 0.7611111111111111 | 0 |
| 0.7618055555555556 | 0 |
| 0.7625000000000001 | 0 |
| 0.7631944444444444 | 0 |
| 0.7638888888888888 | 0 |
| 0.7645833333333334 | 0 |
| 0.7652777777777778 | 0 |
| 0.7659722222222222 | 0 |
| 0.7666666666666666 | 0 |
| 0.7673611111111112 | 0 |
| 0.7680555555555556 | 0 |
| 0.7687499999999999 | 0 |
| 0.7694444444444444 | 0 |
| 0.7701388888888889 | 0 |
| 0.7708333333333334 | 0 |
| 0.7715277777777777 | 0 |
| 0.7722222222222223 | 0 |
| 0.7729166666666667 | 0 |
| 0.7736111111111111 | 0 |
| 0.7743055555555555 | 0 |
| 0.775 | 0 |
| 0.7756944444444445 | 0 |
| 0.7763888888888889 | 0 |
| 0.7770833333333332 | 0 |
| 0.7777777777777778 | 0 |
| 0.7784722222222222 | 0 |
| 0.7791666666666667 | 0 |
| 0.779861111111111 | 0 |
| 0.7805555555555556 | 0 |
| 0.78125 | 0 |
| 0.7819444444444444 | 0 |
| 0.782638888888889 | 0 |
| 0.7833333333333333 | 0 |
| 0.7840277777777778 | 0 |
| 0.7847222222222222 | 0 |
| 0.7854166666666668 | 0 |
| 0.7861111111111111 | 0 |
| 0.7868055555555555 | 0 |
| 0.7875 | 0 |
| 0.7881944444444445 | 0 |
| 0.7888888888888889 | 0 |
| 0.7895833333333333 | 0 |
| 0.7902777777777777 | 0 |
| 0.7909722222222223 | 0 |
| 0.7916666666666666 | 0 |
| 0.7923611111111111 | 0 |
| 0.7930555555555556 | 0 |
| 0.7937500000000001 | 0 |
| 0.7944444444444444 | 0 |
| 0.7951388888888888 | 0 |
| 0.7958333333333334 | 0 |
| 0.7965277777777778 | 0 |
| 0.7972222222222222 | 0 |
| 0.7979166666666666 | 0 |
| 0.7986111111111112 | 0 |
| 0.7993055555555556 | 0 |
| 0.7999999999999999 | 0 |
| 0.8006944444444444 | 0 |
| 0.8013888888888889 | 0 |
| 0.8020833333333334 | 0 |
| 0.8027777777777777 | 0 |
| 0.8034722222222223 | 0 |
| 0.8041666666666667 | 0 |
| 0.8048611111111111 | 0 |
| 0.8055555555555555 | 0 |
| 0.80625 | 0 |
| 0.8069444444444445 | 0 |
| 0.8076388888888889 | 0 |
| 0.8083333333333332 | 0 |
| 0.8090277777777778 | 0 |
| 0.8097222222222222 | 0 |
| 0.8104166666666667 | 0 |
| 0.811111111111111 | 0 |
| 0.8118055555555556 | 0 |
| 0.8125 | 0 |
| 0.8131944444444444 | 0 |
| 0.813888888888889 | 0 |
| 0.8145833333333333 | 0 |
| 0.8152777777777778 | 0 |
| 0.8159722222222222 | 0 |
| 0.8166666666666668 | 0 |
| 0.8173611111111111 | 0 |
| 0.8180555555555555 | 0 |
| 0.81875 | 0 |
| 0.8194444444444445 | 0 |
| 0.8201388888888889 | 0 |
| 0.8208333333333333 | 0 |
| 0.8215277777777777 | 0 |
| 0.8222222222222223 | 0 |
| 0.8229166666666666 | 0 |
| 0.8236111111111111 | 0 |
| 0.8243055555555556 | 0 |
| 0.8250000000000001 | 0 |
| 0.8256944444444444 | 0 |
| 0.8263888888888888 | 0 |
| 0.8270833333333334 | 0 |
| 0.8277777777777778 | 0 |
| 0.8284722222222222 | 0 |
| 0.8291666666666666 | 0 |
| 0.8298611111111112 | 0 |
| 0.8305555555555556 | 0 |
| 0.8312499999999999 | 0 |
| 0.8319444444444444 | 0 |
| 0.8326388888888889 | 0 |
| 0.8333333333333334 | 0 |
| 0.8340277777777777 | 0 |
| 0.8347222222222223 | 0 |
| 0.8354166666666667 | 0 |
| 0.8361111111111111 | 0 |
| 0.8368055555555555 | 0 |
| 0.8375 | 0 |
| 0.8381944444444445 | 0 |
| 0.8388888888888889 | 0 |
| 0.8395833333333332 | 0 |
| 0.8402777777777778 | 0 |
| 0.8409722222222222 | 0 |
| 0.8416666666666667 | 0 |
| 0.842361111111111 | 0 |
| 0.8430555555555556 | 0 |
| 0.84375 | 0 |
| 0.8444444444444444 | 0 |
| 0.845138888888889 | 0 |
| 0.8458333333333333 | 0 |
| 0.8465277777777778 | 0 |
| 0.8472222222222222 | 0 |
| 0.8479166666666668 | 0 |
| 0.8486111111111111 | 0 |
| 0.8493055555555555 | 0 |
| 0.85 | 0 |
| 0.8506944444444445 | 0 |
| 0.8513888888888889 | 0 |
| 0.8520833333333333 | 0 |
| 0.8527777777777777 | 0 |
| 0.8534722222222223 | 0 |
| 0.8541666666666666 | 0 |
| 0.8548611111111111 | 0 |
| 0.8555555555555556 | 0 |
| 0.8562500000000001 | 0 |
| 0.8569444444444444 | 0 |
| 0.8576388888888888 | 0 |
| 0.8583333333333334 | 0 |
| 0.8590277777777778 | 0 |
| 0.8597222222222222 | 0 |
| 0.8604166666666666 | 0 |
| 0.8611111111111112 | 0 |
| 0.8618055555555556 | 0 |
| 0.8624999999999999 | 0 |
| 0.8631944444444444 | 0 |
| 0.8638888888888889 | 0 |
| 0.8645833333333334 | 0 |
| 0.8652777777777777 | 0 |
| 0.8659722222222223 | 0 |
| 0.8666666666666667 | 0 |
| 0.8673611111111111 | 0 |
| 0.8680555555555555 | 0 |
| 0.86875 | 0 |
| 0.8694444444444445 | 0 |
| 0.8701388888888889 | 0 |
| 0.8708333333333332 | 0 |
| 0.8715277777777778 | 0 |
| 0.8722222222222222 | 0 |
| 0.8729166666666667 | 0 |
| 0.873611111111111 | 0 |
| 0.8743055555555556 | 0 |
| 0.875 | 0 |
| 0.8756944444444444 | 0 |
| 0.876388888888889 | 0 |
| 0.8770833333333333 | 0 |
| 0.8777777777777778 | 0 |
| 0.8784722222222222 | 0 |
| 0.8791666666666668 | 0 |
| 0.8798611111111111 | 0 |
| 0.8805555555555555 | 0 |
| 0.88125 | 0 |
| 0.8819444444444445 | 0 |
| 0.8826388888888889 | 0 |
| 0.8833333333333333 | 0 |
| 0.8840277777777777 | 0 |
| 0.8847222222222223 | 0 |
| 0.8854166666666666 | 0 |
| 0.8861111111111111 | 0 |
| 0.8868055555555556 | 0 |
| 0.8875000000000001 | 0 |
| 0.8881944444444444 | 0 |
| 0.8888888888888888 | 0 |
| 0.8895833333333334 | 0 |
| 0.8902777777777778 | 0 |
| 0.8909722222222222 | 0 |
| 0.8916666666666666 | 0 |
| 0.8923611111111112 | 0 |
| 0.8930555555555556 | 0 |
| 0.8937499999999999 | 0 |
| 0.8944444444444444 | 0 |
| 0.8951388888888889 | 0 |
| 0.8958333333333334 | 0 |
| 0.8965277777777777 | 0 |
| 0.8972222222222223 | 0 |
| 0.8979166666666667 | 0 |
| 0.8986111111111111 | 0 |
| 0.8993055555555555 | 0 |
| 0.9 | 0 |
| 0.9006944444444445 | 0 |
| 0.9013888888888889 | 0 |
| 0.9020833333333332 | 0 |
| 0.9027777777777778 | 0 |
| 0.9034722222222222 | 0 |
| 0.9041666666666667 | 0 |
| 0.904861111111111 | 0 |
| 0.9055555555555556 | 0 |
| 0.90625 | 0 |
| 0.9069444444444444 | 0 |
| 0.907638888888889 | 0 |
| 0.9083333333333333 | 0 |
| 0.9090277777777778 | 0 |
| 0.9097222222222222 | 0 |
| 0.9104166666666668 | 0 |
| 0.9111111111111111 | 0 |
| 0.9118055555555555 | 0 |
| 0.9125 | 0 |
| 0.9131944444444445 | 0 |
| 0.9138888888888889 | 0 |
| 0.9145833333333333 | 0 |
| 0.9152777777777777 | 0 |
| 0.9159722222222223 | 0 |
| 0.9166666666666666 | 0 |
| 0.9173611111111111 | 0 |
| 0.9180555555555556 | 0 |
| 0.9187500000000001 | 0 |
| 0.9194444444444444 | 0 |
| 0.9201388888888888 | 0 |
| 0.9208333333333334 | 0 |
| 0.9215277777777778 | 0 |
| 0.9222222222222222 | 0 |
| 0.9229166666666666 | 0 |
| 0.9236111111111112 | 0 |
| 0.9243055555555556 | 0 |
| 0.9249999999999999 | 0 |
| 0.9256944444444444 | 0 |
| 0.9263888888888889 | 0 |
| 0.9270833333333334 | 0 |
| 0.9277777777777777 | 0 |
| 0.9284722222222223 | 0 |
| 0.9291666666666667 | 0 |
| 0.9298611111111111 | 0 |
| 0.9305555555555555 | 0 |
| 0.93125 | 0 |
| 0.9319444444444445 | 0 |
| 0.9326388888888889 | 0 |
| 0.9333333333333332 | 0 |
| 0.9340277777777778 | 0 |
| 0.9347222222222222 | 0 |
| 0.9354166666666667 | 0 |
| 0.936111111111111 | 0 |
| 0.9368055555555556 | 0 |
| 0.9375 | 0 |
| 0.9381944444444444 | 0 |
| 0.938888888888889 | 0 |
| 0.9395833333333333 | 0 |
| 0.9402777777777778 | 0 |
| 0.9409722222222222 | 0 |
| 0.9416666666666668 | 0 |
| 0.9423611111111111 | 0 |
| 0.9430555555555555 | 0 |
| 0.94375 | 0 |
| 0.9444444444444445 | 0 |
| 0.9451388888888889 | 0 |
| 0.9458333333333333 | 0 |
| 0.9465277777777777 | 0 |
| 0.9472222222222223 | 0 |
| 0.9479166666666666 | 0 |
| 0.9486111111111111 | 0 |
| 0.9493055555555556 | 0 |
| 0.9500000000000001 | 0 |
| 0.9506944444444444 | 0 |
| 0.9513888888888888 | 0 |
| 0.9520833333333334 | 0 |
| 0.9527777777777778 | 0 |
| 0.9534722222222222 | 0 |
| 0.9541666666666666 | 0 |
| 0.9548611111111112 | 0 |
| 0.9555555555555556 | 0 |
| 0.9562499999999999 | 0 |
| 0.9569444444444444 | 0 |
| 0.9576388888888889 | 0 |
| 0.9583333333333334 | 0 |
| 0.9590277777777777 | 0 |
| 0.9597222222222223 | 0 |
| 0.9604166666666667 | 0 |
| 0.9611111111111111 | 0 |
| 0.9618055555555555 | 0 |
| 0.9625 | 0 |
| 0.9631944444444445 | 0 |
| 0.9638888888888889 | 0 |
| 0.9645833333333332 | 0 |
| 0.9652777777777778 | 0 |
| 0.9659722222222222 | 0 |
| 0.9666666666666667 | 0 |
| 0.967361111111111 | 0 |
| 0.9680555555555556 | 0 |
| 0.96875 | 0 |
| 0.9694444444444444 | 0 |
| 0.970138888888889 | 0 |
| 0.9708333333333333 | 0 |
| 0.9715277777777778 | 0 |
| 0.9722222222222222 | 0 |
| 0.9729166666666668 | 0 |
| 0.9736111111111111 | 0 |
| 0.9743055555555555 | 0 |
| 0.975 | 0 |
| 0.9756944444444445 | 0 |
| 0.9763888888888889 | 0 |
| 0.9770833333333333 | 0 |
| 0.9777777777777777 | 0 |
| 0.9784722222222223 | 0 |
| 0.9791666666666666 | 0 |
| 0.9798611111111111 | 0 |
| 0.9805555555555556 | 0 |
| 0.9812500000000001 | 0 |
| 0.9819444444444444 | 0 |
| 0.9826388888888888 | 0 |
| 0.9833333333333334 | 0 |
| 0.9840277777777778 | 0 |
| 0.9847222222222222 | 0 |
| 0.9854166666666666 | 0 |
| 0.9861111111111112 | 0 |
| 0.9868055555555556 | 0 |
| 0.9874999999999999 | 0 |
| 0.9881944444444444 | 0 |
| 0.9888888888888889 | 0 |
| 0.9895833333333334 | 0 |
| 0.9902777777777777 | 0 |
| 0.9909722222222223 | 0 |
| 0.9916666666666667 | 0 |
| 0.9923611111111111 | 0 |
| 0.9930555555555555 | 0 |
| 0.99375 | 0 |
| 0.9944444444444445 | 0 |
| 0.9951388888888889 | 0 |
| 0.9958333333333332 | 0 |
| 0.9965277777777778 | 0 |
| 0.9972222222222222 | 0 |
| 0.9979166666666667 | 0 |
| 0.998611111111111 | 0 |
| 0.9993055555555556 | 0 |